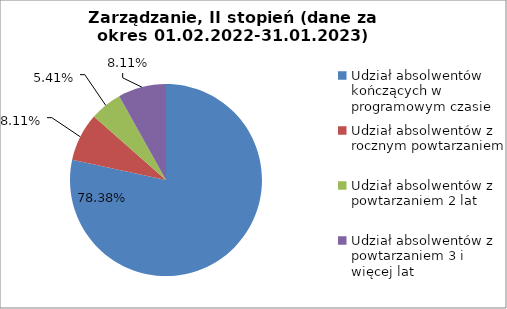
| Category | Series 0 |
|---|---|
| Udział absolwentów kończących w programowym czasie | 78.378 |
| Udział absolwentów z rocznym powtarzaniem | 8.108 |
| Udział absolwentów z powtarzaniem 2 lat | 5.405 |
| Udział absolwentów z powtarzaniem 3 i więcej lat | 8.108 |